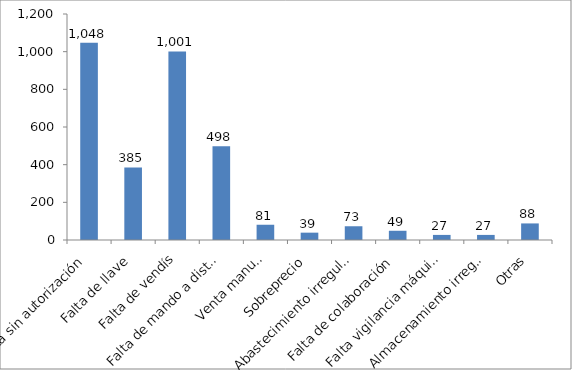
| Category | Expedientes iniciados en 2016 |
|---|---|
| Venta sin autorización | 1048 |
| Falta de llave | 385 |
| Falta de vendís | 1001 |
| Falta de mando a distancia | 498 |
| Venta manual | 81 |
| Sobreprecio | 39 |
| Abastecimiento irregular | 73 |
| Falta de colaboración | 49 |
| Falta vigilancia máquinas | 27 |
| Almacenamiento irregular | 27 |
| Otras | 88 |